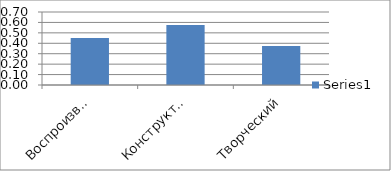
| Category | Series 0 |
|---|---|
| Воспроизводящий | 0.45 |
| Конструктивный | 0.575 |
| Творческий | 0.375 |